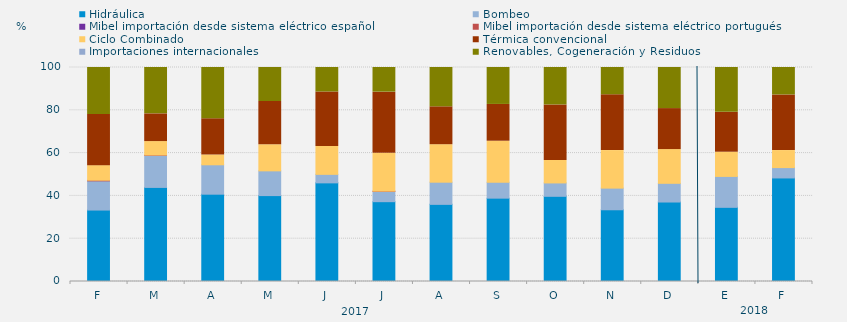
| Category | Hidráulica | Bombeo | Mibel importación desde sistema eléctrico español | Mibel importación desde sistema eléctrico portugués | Ciclo Combinado | Térmica convencional | Importaciones internacionales | Renovables, Cogeneración y Residuos |
|---|---|---|---|---|---|---|---|---|
| F | 33.383 | 13.641 | 0 | 0.298 | 6.82 | 23.884 | 0 | 21.974 |
| M | 43.966 | 14.984 | 0 | 0.135 | 6.303 | 12.943 | 0 | 21.669 |
| A | 40.799 | 13.738 | 0 | 0 | 4.583 | 16.933 | 0 | 23.947 |
| M | 40.143 | 11.559 | 0 | 0 | 12.186 | 20.228 | 0 | 15.883 |
| J | 46.088 | 3.981 | 0 | 0 | 13.032 | 25.463 | 0 | 11.435 |
| J | 37.298 | 4.783 | 0 | 0.134 | 17.675 | 28.595 | 0 | 11.514 |
| A | 36.044 | 10.361 | 0 | 0 | 17.518 | 17.708 | 0 | 18.369 |
| S | 38.947 | 7.407 | 0 | 0 | 19.201 | 17.187 | 0 | 17.257 |
| O | 39.807 | 6.25 | 0 | 0 | 10.484 | 25.963 | 0 | 17.496 |
| N | 33.519 | 10.116 | 0 | 0 | 17.546 | 26.088 | 0 | 12.731 |
| D | 37.142 | 8.737 | 0 | 0 | 15.771 | 19.153 | 0 | 19.198 |
| E | 34.655 | 14.449 | 0 | 0 | 11.313 | 18.638 | 0 | 20.945 |
| F | 48.388 | 4.836 | 0 | 0 | 7.961 | 25.992 | 0 | 12.822 |